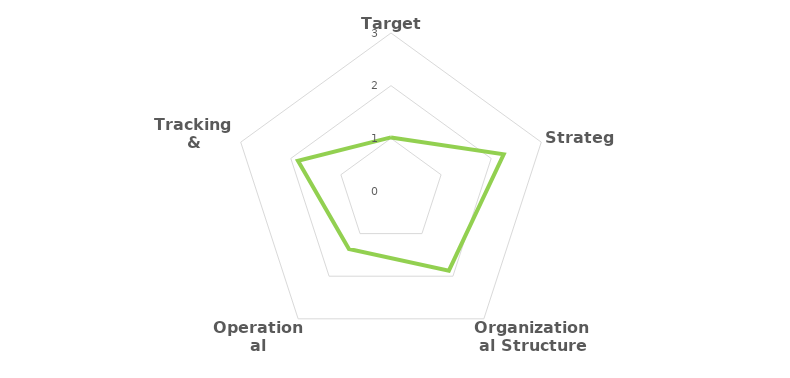
| Category | Score  |
|---|---|
| Targets | 1.017 |
| Strategy | 2.25 |
| Organizational Structure | 1.87 |
| Operational Measures | 1.36 |
| Tracking & Reporting | 1.857 |